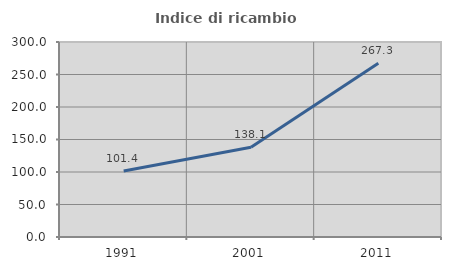
| Category | Indice di ricambio occupazionale  |
|---|---|
| 1991.0 | 101.389 |
| 2001.0 | 138.068 |
| 2011.0 | 267.333 |